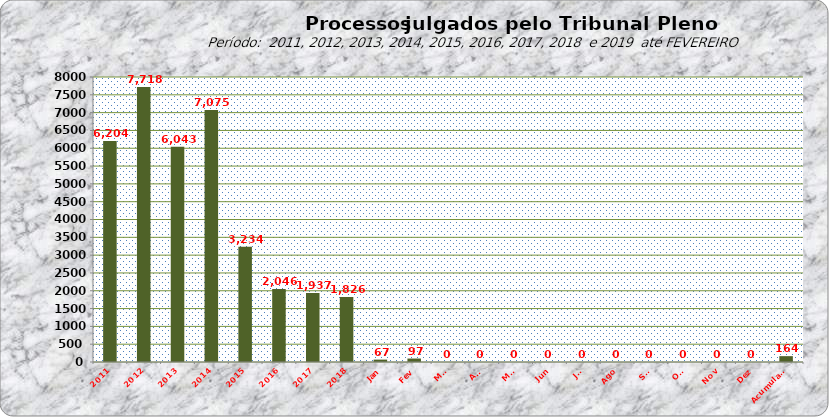
| Category | Series 0 |
|---|---|
| 2011 | 6204 |
| 2012 | 7718 |
| 2013 | 6043 |
| 2014 | 7075 |
| 2015 | 3234 |
| 2016 | 2046 |
| 2017 | 1937 |
| 2018 | 1826 |
| Jan | 67 |
| Fev | 97 |
| Mar | 0 |
| Abr | 0 |
| Mai | 0 |
| Jun | 0 |
| Jul | 0 |
| Ago | 0 |
| Set | 0 |
| Out | 0 |
| Nov | 0 |
| Dez | 0 |
| Acumulado | 164 |